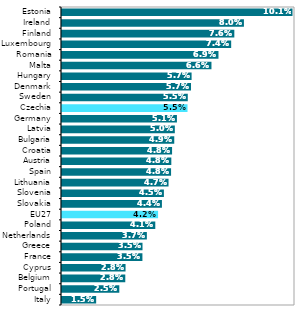
| Category | Series 0 |
|---|---|
| Italy | 0.015 |
| Portugal | 0.025 |
| Belgium | 0.028 |
| Cyprus | 0.028 |
| France | 0.035 |
| Greece | 0.035 |
| Netherlands | 0.037 |
| Poland | 0.041 |
| EU27 | 0.042 |
| Slovakia | 0.044 |
| Slovenia | 0.045 |
| Lithuania | 0.047 |
| Spain | 0.048 |
| Austria | 0.048 |
| Croatia | 0.048 |
| Bulgaria | 0.049 |
| Latvia | 0.05 |
| Germany | 0.051 |
| Czechia | 0.055 |
| Sweden | 0.055 |
| Denmark | 0.057 |
| Hungary | 0.057 |
| Malta | 0.066 |
| Romania | 0.069 |
| Luxembourg | 0.074 |
| Finland | 0.076 |
| Ireland | 0.08 |
| Estonia | 0.101 |